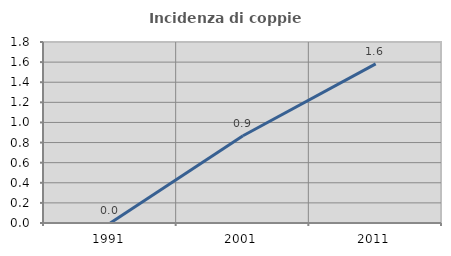
| Category | Incidenza di coppie miste |
|---|---|
| 1991.0 | 0 |
| 2001.0 | 0.868 |
| 2011.0 | 1.583 |